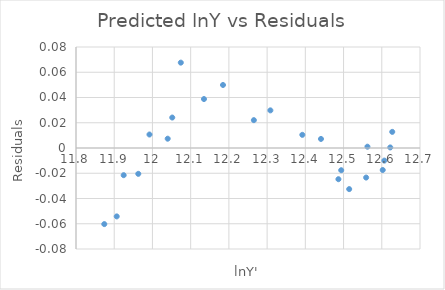
| Category | Residuals |
|---|---|
| 11.87399423576776 | -0.06 |
| 11.90654922515149 | -0.054 |
| 11.924734701495169 | -0.022 |
| 11.962957007514436 | -0.02 |
| 11.992201994757876 | 0.011 |
| 12.039903889086908 | 0.007 |
| 12.05182924681898 | 0.024 |
| 12.074218469976064 | 0.068 |
| 12.134814641975666 | 0.039 |
| 12.184569310092977 | 0.05 |
| 12.26533777689067 | 0.022 |
| 12.308547621513746 | 0.03 |
| 12.39212652454884 | 0.01 |
| 12.440907088109148 | 0.007 |
| 12.48656142257092 | -0.025 |
| 12.493843091778611 | -0.018 |
| 12.51473416647567 | -0.033 |
| 12.55907469779941 | -0.023 |
| 12.562492055217394 | 0.001 |
| 12.602476869495753 | -0.017 |
| 12.606750439132052 | -0.01 |
| 12.62219848246039 | 0 |
| 12.627380645624498 | 0.013 |